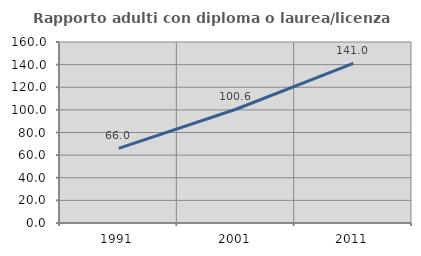
| Category | Rapporto adulti con diploma o laurea/licenza media  |
|---|---|
| 1991.0 | 65.993 |
| 2001.0 | 100.56 |
| 2011.0 | 141.015 |